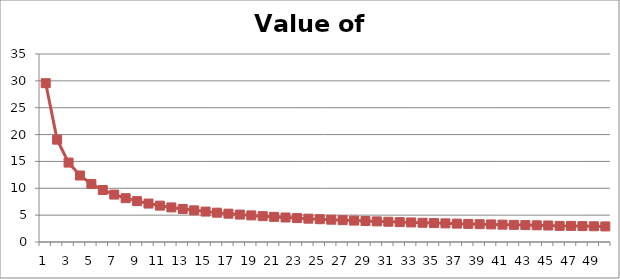
| Category | Value of option |
|---|---|
| 0 | 29.567 |
| 1 | 19.057 |
| 2 | 14.783 |
| 3 | 12.379 |
| 4 | 10.806 |
| 5 | 9.682 |
| 6 | 8.83 |
| 7 | 8.159 |
| 8 | 7.613 |
| 9 | 7.158 |
| 10 | 6.772 |
| 11 | 6.439 |
| 12 | 6.149 |
| 13 | 5.892 |
| 14 | 5.664 |
| 15 | 5.46 |
| 16 | 5.275 |
| 17 | 5.107 |
| 18 | 4.953 |
| 19 | 4.812 |
| 20 | 4.681 |
| 21 | 4.561 |
| 22 | 4.448 |
| 23 | 4.344 |
| 24 | 4.246 |
| 25 | 4.154 |
| 26 | 4.068 |
| 27 | 3.987 |
| 28 | 3.91 |
| 29 | 3.837 |
| 30 | 3.768 |
| 31 | 3.703 |
| 32 | 3.64 |
| 33 | 3.581 |
| 34 | 3.524 |
| 35 | 3.47 |
| 36 | 3.418 |
| 37 | 3.369 |
| 38 | 3.321 |
| 39 | 3.275 |
| 40 | 3.231 |
| 41 | 3.189 |
| 42 | 3.149 |
| 43 | 3.109 |
| 44 | 3.071 |
| 45 | 3 |
| 46 | 3 |
| 47 | 2.966 |
| 48 | 2.932 |
| 49 | 2.9 |